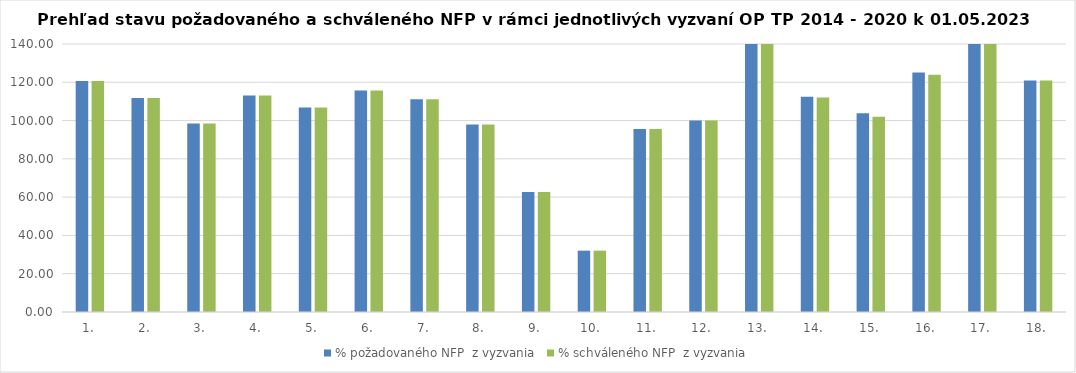
| Category | % požadovaného NFP  z vyzvania | % schváleného NFP  z vyzvania |
|---|---|---|
| 1. | 120.673 | 120.673 |
| 2. | 111.84 | 111.84 |
| 3. | 98.474 | 98.474 |
| 4. | 113.162 | 113.162 |
| 5. | 106.767 | 106.767 |
| 6. | 115.745 | 115.745 |
| 7. | 111.089 | 111.089 |
| 8. | 97.998 | 97.998 |
| 9. | 62.727 | 62.727 |
| 10. | 32.041 | 32.041 |
| 11. | 95.621 | 95.621 |
| 12. | 100.009 | 100.009 |
| 13. | 151.956 | 151.956 |
| 14. | 112.426 | 112.091 |
| 15. | 103.766 | 101.987 |
| 16. | 125.057 | 123.881 |
| 17. | 171.931 | 171.931 |
| 18. | 120.879 | 120.879 |